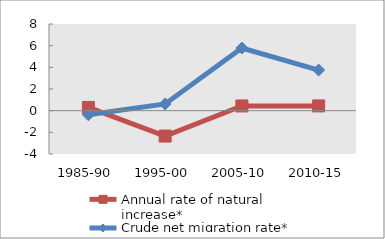
| Category | Annual rate of natural increase* | Crude net migration rate* |
|---|---|---|
| 1985-90 | 0.301 | -0.381 |
| 1995-00 | -2.343 | 0.618 |
| 2005-10 | 0.435 | 5.781 |
| 2010-15 | 0.438 | 3.75 |